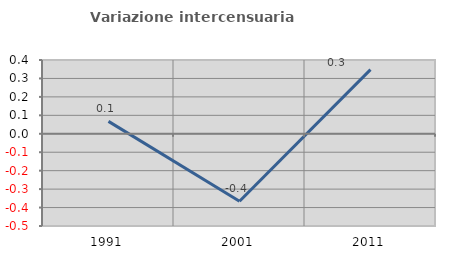
| Category | Variazione intercensuaria annua |
|---|---|
| 1991.0 | 0.067 |
| 2001.0 | -0.365 |
| 2011.0 | 0.348 |